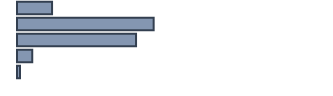
| Category | Series 0 |
|---|---|
| 0 | 11.345 |
| 1 | 44.226 |
| 2 | 38.526 |
| 3 | 4.913 |
| 4 | 0.99 |